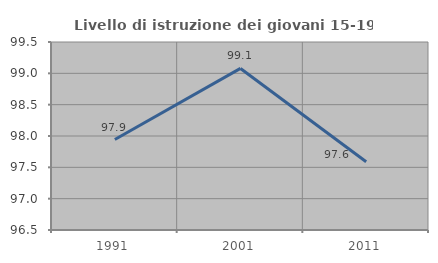
| Category | Livello di istruzione dei giovani 15-19 anni |
|---|---|
| 1991.0 | 97.943 |
| 2001.0 | 99.078 |
| 2011.0 | 97.59 |